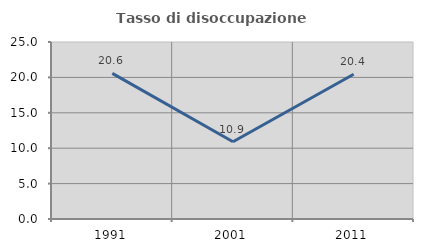
| Category | Tasso di disoccupazione giovanile  |
|---|---|
| 1991.0 | 20.561 |
| 2001.0 | 10.909 |
| 2011.0 | 20.438 |